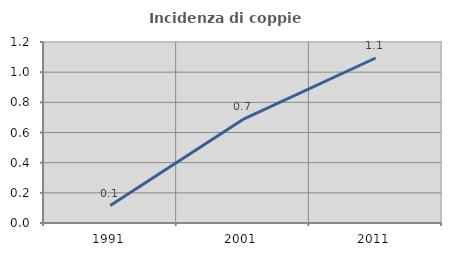
| Category | Incidenza di coppie miste |
|---|---|
| 1991.0 | 0.116 |
| 2001.0 | 0.687 |
| 2011.0 | 1.094 |